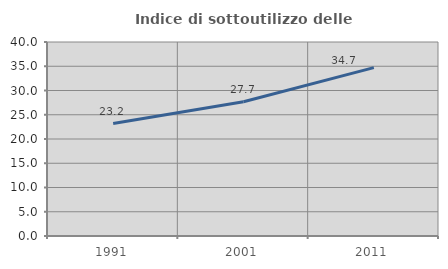
| Category | Indice di sottoutilizzo delle abitazioni  |
|---|---|
| 1991.0 | 23.194 |
| 2001.0 | 27.685 |
| 2011.0 | 34.711 |